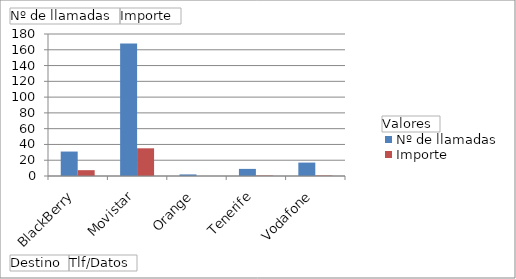
| Category | Nº de llamadas | Importe |
|---|---|---|
| BlackBerry | 31 | 7.382 |
| Movistar | 168 | 35.111 |
| Orange | 2 | 0 |
| Tenerife | 9 | 0.561 |
| Vodafone | 17 | 0.6 |